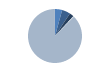
| Category | Series 0 |
|---|---|
| ARRASTRE | 23 |
| CERCO | 27 |
| PALANGRE | 14 |
| REDES DE ENMALLE | 2 |
| ARTES MENORES | 470 |
| SIN TIPO ASIGNADO | 1 |